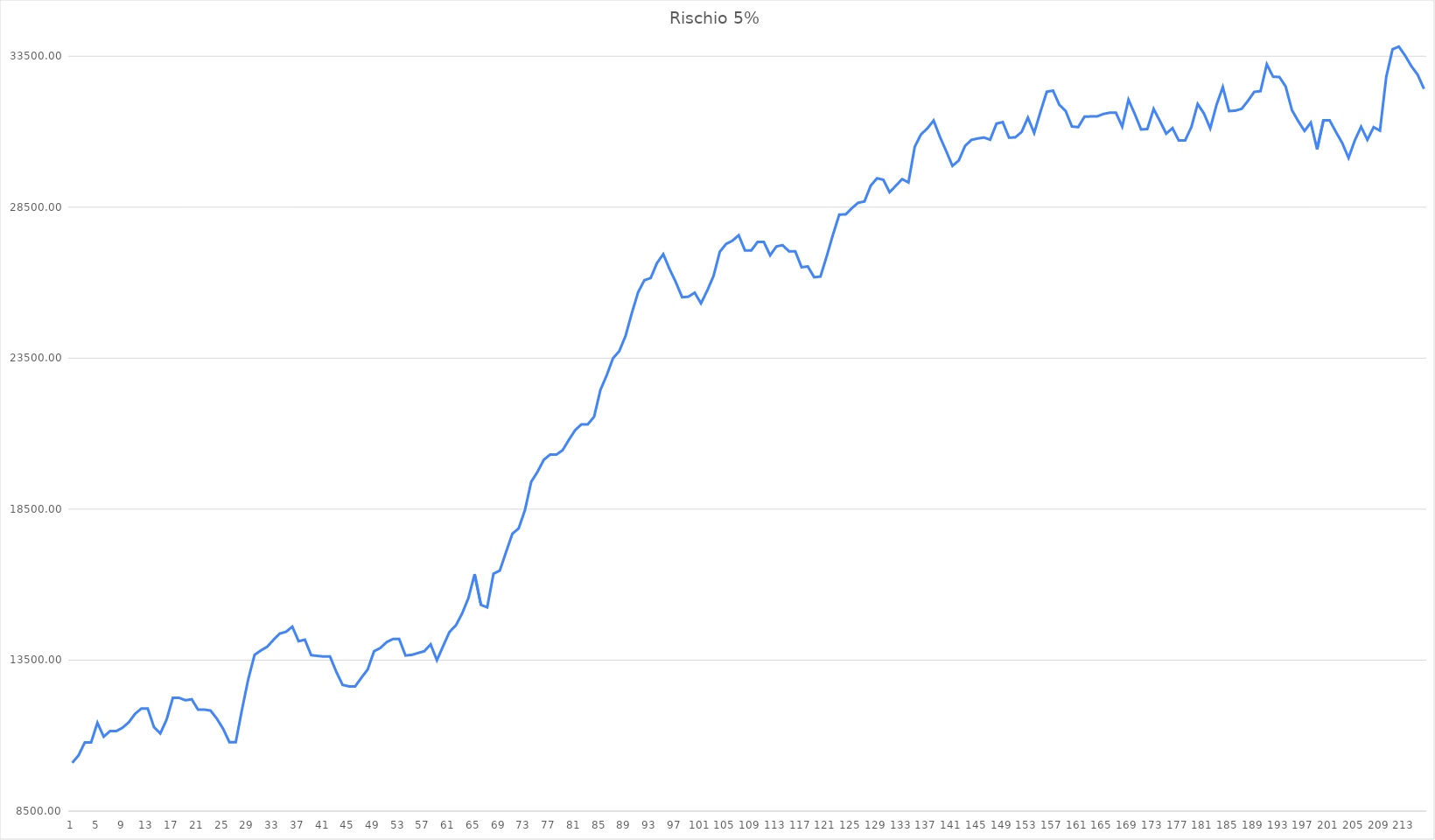
| Category | Series 0 |
|---|---|
| 0 | 10100 |
| 1 | 10346.4 |
| 2 | 10777.6 |
| 3 | 10777.6 |
| 4 | 11425 |
| 5 | 10964.2 |
| 6 | 11150.2 |
| 7 | 11150.2 |
| 8 | 11262.2 |
| 9 | 11444.6 |
| 10 | 11725.1 |
| 11 | 11898.7 |
| 12 | 11898.7 |
| 13 | 11280.46 |
| 14 | 11071.16 |
| 15 | 11529.96 |
| 16 | 12252.06 |
| 17 | 12252.06 |
| 18 | 12172.06 |
| 19 | 12204.06 |
| 20 | 11862.46 |
| 21 | 11862.46 |
| 22 | 11829.66 |
| 23 | 11559.96 |
| 24 | 11225.16 |
| 25 | 10780.36 |
| 26 | 10780.36 |
| 27 | 11868.36 |
| 28 | 12876.36 |
| 29 | 13676.36 |
| 30 | 13820.36 |
| 31 | 13942.76 |
| 32 | 14170.61 |
| 33 | 14379.86 |
| 34 | 14438.66 |
| 35 | 14607.92 |
| 36 | 14125.76 |
| 37 | 14176.96 |
| 38 | 13664.96 |
| 39 | 13640.96 |
| 40 | 13619.36 |
| 41 | 13619.36 |
| 42 | 13112.21 |
| 43 | 12680.61 |
| 44 | 12632.61 |
| 45 | 12632.61 |
| 46 | 12920.37 |
| 47 | 13195.05 |
| 48 | 13795.05 |
| 49 | 13903.05 |
| 50 | 14094.93 |
| 51 | 14198.28 |
| 52 | 14198.28 |
| 53 | 13654.28 |
| 54 | 13674.2 |
| 55 | 13736.6 |
| 56 | 13796.6 |
| 57 | 14021.6 |
| 58 | 13496.8 |
| 59 | 13970 |
| 60 | 14434.75 |
| 61 | 14644.75 |
| 62 | 15040.75 |
| 63 | 15550.75 |
| 64 | 16348.05 |
| 65 | 15331.3 |
| 66 | 15248.3 |
| 67 | 16363.85 |
| 68 | 16464.65 |
| 69 | 17081.05 |
| 70 | 17685.85 |
| 71 | 17862.25 |
| 72 | 18467.05 |
| 73 | 19407.85 |
| 74 | 19735.45 |
| 75 | 20134.81 |
| 76 | 20306.33 |
| 77 | 20306.33 |
| 78 | 20455.08 |
| 79 | 20800.18 |
| 80 | 21120.5 |
| 81 | 21310.78 |
| 82 | 21310.78 |
| 83 | 21560.02 |
| 84 | 22444.42 |
| 85 | 22930.82 |
| 86 | 23494.02 |
| 87 | 23731.62 |
| 88 | 24235.62 |
| 89 | 24991.62 |
| 90 | 25681.62 |
| 91 | 26082.82 |
| 92 | 26153.62 |
| 93 | 26648.62 |
| 94 | 26945.98 |
| 95 | 26451.98 |
| 96 | 26016.38 |
| 97 | 25518.38 |
| 98 | 25536.38 |
| 99 | 25669.18 |
| 100 | 25315.18 |
| 101 | 25739.98 |
| 102 | 26223.04 |
| 103 | 27027.04 |
| 104 | 27283.04 |
| 105 | 27390.56 |
| 106 | 27570.56 |
| 107 | 27066.68 |
| 108 | 27066.68 |
| 109 | 27348.43 |
| 110 | 27348.43 |
| 111 | 26905.63 |
| 112 | 27200.83 |
| 113 | 27241.63 |
| 114 | 27037.79 |
| 115 | 27037.79 |
| 116 | 26512.79 |
| 117 | 26537.09 |
| 118 | 26180.69 |
| 119 | 26202.56 |
| 120 | 26874.56 |
| 121 | 27594.81 |
| 122 | 28256.31 |
| 123 | 28261.75 |
| 124 | 28466.43 |
| 125 | 28647.87 |
| 126 | 28689.63 |
| 127 | 29213.79 |
| 128 | 29457.39 |
| 129 | 29410.19 |
| 130 | 28997.19 |
| 131 | 29212.23 |
| 132 | 29431.11 |
| 133 | 29320.56 |
| 134 | 30498.16 |
| 135 | 30912.16 |
| 136 | 31106.2 |
| 137 | 31371.85 |
| 138 | 30832.85 |
| 139 | 30360.95 |
| 140 | 29868.15 |
| 141 | 30046.35 |
| 142 | 30524.85 |
| 143 | 30728.9 |
| 144 | 30774.9 |
| 145 | 30807.35 |
| 146 | 30735.59 |
| 147 | 31267.94 |
| 148 | 31317.99 |
| 149 | 30802.79 |
| 150 | 30814.34 |
| 151 | 30991.93 |
| 152 | 31466.53 |
| 153 | 30960.64 |
| 154 | 31661.34 |
| 155 | 32323.54 |
| 156 | 32360.34 |
| 157 | 31889.94 |
| 158 | 31688.94 |
| 159 | 31173.74 |
| 160 | 31151.42 |
| 161 | 31497.92 |
| 162 | 31506.11 |
| 163 | 31506.11 |
| 164 | 31587.71 |
| 165 | 31628.51 |
| 166 | 31628.51 |
| 167 | 31168.61 |
| 168 | 32060.69 |
| 169 | 31587.41 |
| 170 | 31073.91 |
| 171 | 31089.71 |
| 172 | 31753.91 |
| 173 | 31351.64 |
| 174 | 30935.64 |
| 175 | 31118.64 |
| 176 | 30708.24 |
| 177 | 30708.24 |
| 178 | 31153.36 |
| 179 | 31918.41 |
| 180 | 31604.85 |
| 181 | 31109.25 |
| 182 | 31886.85 |
| 183 | 32478.85 |
| 184 | 31683.61 |
| 185 | 31698.49 |
| 186 | 31757.89 |
| 187 | 32021.67 |
| 188 | 32318.45 |
| 189 | 32344.1 |
| 190 | 33233.3 |
| 191 | 32822.02 |
| 192 | 32811.46 |
| 193 | 32496.46 |
| 194 | 31714.38 |
| 195 | 31349.88 |
| 196 | 31026.48 |
| 197 | 31300.98 |
| 198 | 30416.04 |
| 199 | 31375.14 |
| 200 | 31375.14 |
| 201 | 30990.34 |
| 202 | 30625.36 |
| 203 | 30132.88 |
| 204 | 30713.68 |
| 205 | 31163.85 |
| 206 | 30732.25 |
| 207 | 31149.85 |
| 208 | 31036.45 |
| 209 | 32818.6 |
| 210 | 33730.36 |
| 211 | 33818.68 |
| 212 | 33521.08 |
| 213 | 33169.08 |
| 214 | 32886.84 |
| 215 | 32418.68 |